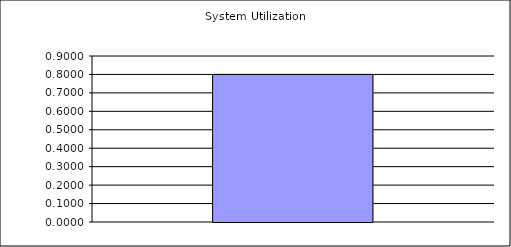
| Category | System Utilization |
|---|---|
| 0 | 0.8 |